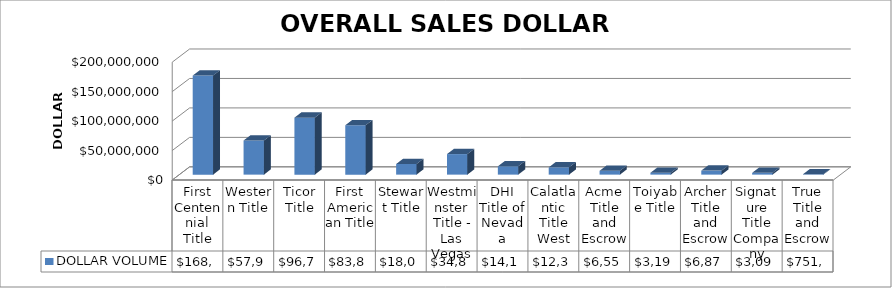
| Category | DOLLAR VOLUME |
|---|---|
| First Centennial Title | 168126206 |
| Western Title | 57955350.5 |
| Ticor Title | 96751567.82 |
| First American Title | 83857889 |
| Stewart Title | 18016124 |
| Westminster Title - Las Vegas | 34875406 |
| DHI Title of Nevada | 14164041 |
| Calatlantic Title West | 12371099 |
| Acme Title and Escrow | 6551500 |
| Toiyabe Title | 3194500 |
| Archer Title and Escrow | 6875300 |
| Signature Title Company | 3094000 |
| True Title and Escrow | 751000 |